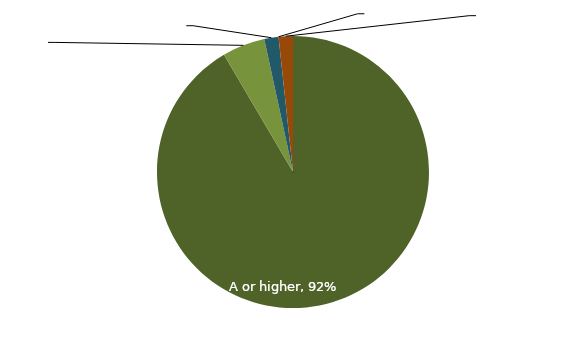
| Category | Series 0 |
|---|---|
| A or higher | 0.915 |
| A- | 0.051 |
| BBB+ | 0.017 |
| BBB | 0 |
| BBB- | 0 |
| Below BBB- | 0.017 |